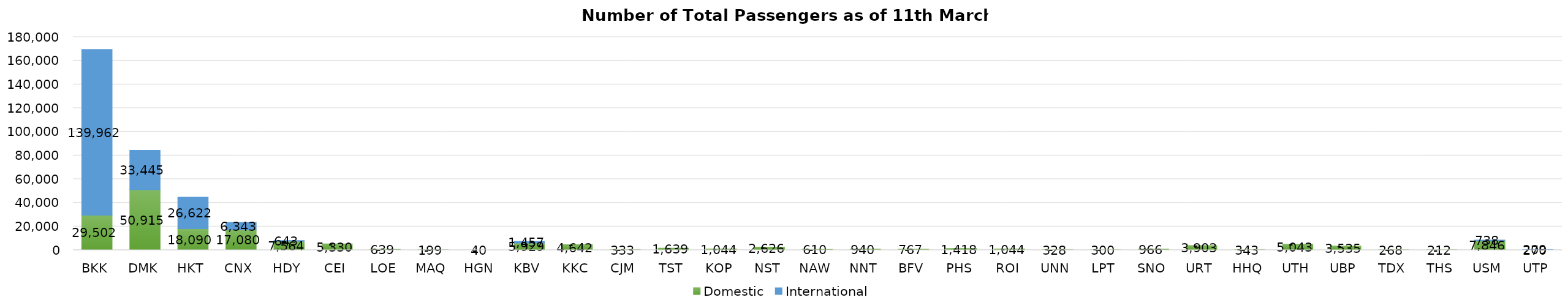
| Category | Domestic | International |
|---|---|---|
| BKK | 29502 | 139962 |
| DMK | 50915 | 33445 |
| HKT | 18090 | 26622 |
| CNX | 17080 | 6343 |
| HDY | 7564 | 643 |
| CEI | 5330 | 0 |
| LOE | 639 | 0 |
| MAQ | 199 | 0 |
| HGN | 40 | 0 |
| KBV | 5929 | 1457 |
| KKC | 4642 | 0 |
| CJM | 333 | 0 |
| TST | 1639 | 0 |
| KOP | 1044 | 0 |
| NST | 2626 | 0 |
| NAW | 610 | 0 |
| NNT | 940 | 0 |
| BFV | 767 | 0 |
| PHS | 1418 | 0 |
| ROI | 1044 | 0 |
| UNN | 328 | 0 |
| LPT | 300 | 0 |
| SNO | 966 | 0 |
| URT | 3903 | 0 |
| HHQ | 343 | 0 |
| UTH | 5043 | 0 |
| UBP | 3535 | 0 |
| TDX | 268 | 0 |
| THS | 212 | 0 |
| USM | 7846 | 738 |
| UTP | 270 | 209 |